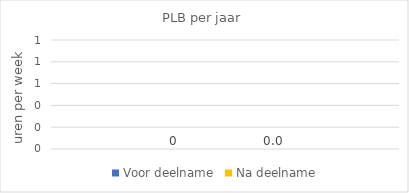
| Category | Voor deelname | Na deelname |
|---|---|---|
| 0 | 0 | 0 |